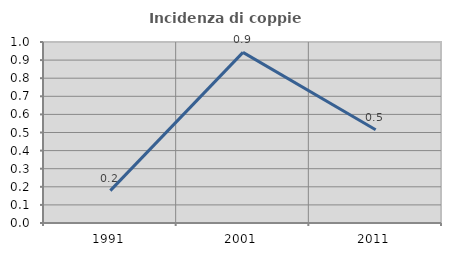
| Category | Incidenza di coppie miste |
|---|---|
| 1991.0 | 0.179 |
| 2001.0 | 0.943 |
| 2011.0 | 0.515 |